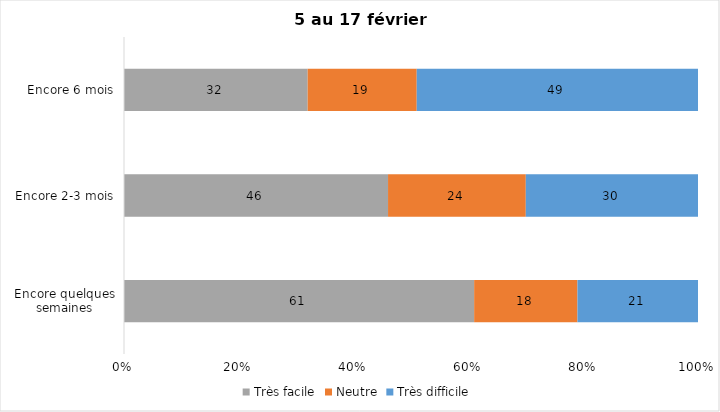
| Category | Très facile | Neutre | Très difficile |
|---|---|---|---|
| Encore quelques semaines | 61 | 18 | 21 |
| Encore 2-3 mois | 46 | 24 | 30 |
| Encore 6 mois | 32 | 19 | 49 |